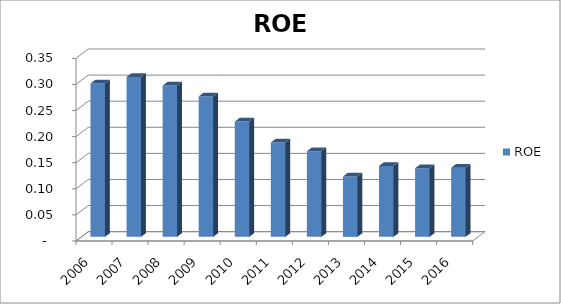
| Category | ROE |
|---|---|
| 2006.0 | 0.294 |
| 2007.0 | 0.306 |
| 2008.0 | 0.29 |
| 2009.0 | 0.269 |
| 2010.0 | 0.221 |
| 2011.0 | 0.181 |
| 2012.0 | 0.164 |
| 2013.0 | 0.116 |
| 2014.0 | 0.136 |
| 2015.0 | 0.132 |
| 2016.0 | 0.132 |